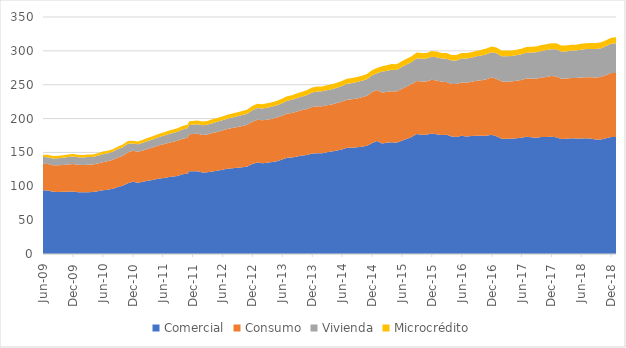
| Category | Comercial | Consumo | Vivienda | Microcrédito |
|---|---|---|---|---|
| 2009-06-01 | 94225.092 | 39039.837 | 9916.214 | 3437.867 |
| 2009-07-01 | 93686.3 | 39134.007 | 10150.324 | 3510.122 |
| 2009-08-01 | 91938.416 | 39244.316 | 10003.677 | 3579.272 |
| 2009-09-01 | 91622.144 | 39394.034 | 10320.07 | 3648.828 |
| 2009-10-01 | 91892.654 | 39705.636 | 10636.736 | 3727.088 |
| 2009-11-01 | 91781.249 | 40412.918 | 10924.337 | 3753.382 |
| 2009-12-01 | 92316.734 | 40580.035 | 10958.491 | 3763.796 |
| 2010-01-01 | 91199.98 | 40461.016 | 11111.676 | 3744.079 |
| 2010-02-01 | 91151.357 | 40379.171 | 11120.686 | 3731.914 |
| 2010-03-01 | 91209.664 | 40456.595 | 11423.084 | 3712.817 |
| 2010-04-01 | 91500.243 | 40556.6 | 11220.527 | 3716.143 |
| 2010-05-01 | 92567.665 | 41038.504 | 11548.231 | 3728.21 |
| 2010-06-01 | 94126.09 | 41507.552 | 11853.031 | 3758.381 |
| 2010-07-01 | 95051.178 | 42085.769 | 11622.499 | 3786.095 |
| 2010-08-01 | 96369.209 | 42696.853 | 11936.118 | 3851.131 |
| 2010-09-01 | 98987.373 | 43582.775 | 12362.652 | 3917.474 |
| 2010-10-01 | 100913.874 | 44344.201 | 12442.525 | 4008.094 |
| 2010-11-01 | 104608.953 | 45201.392 | 12821.618 | 4069.382 |
| 2010-12-01 | 106588.318 | 45779.138 | 10693.835 | 4090.206 |
| 2011-01-01 | 105171.857 | 45865.705 | 10945.951 | 4077.86 |
| 2011-02-01 | 106726.433 | 46261.907 | 11248.09 | 4608.809 |
| 2011-03-01 | 108153.454 | 46903.448 | 11644.89 | 4678.279 |
| 2011-04-01 | 109387.742 | 47851.951 | 11992.957 | 4751.729 |
| 2011-05-11 | 111376.414 | 49121.711 | 12404.411 | 4826.404 |
| 2011-06-11 | 112339.645 | 50059.867 | 12571.017 | 4900.678 |
| 2011-07-11 | 113604.77 | 50844.241 | 12921.269 | 4977.234 |
| 2011-08-31 | 115314.981 | 51849.806 | 13360.476 | 5095.459 |
| 2011-09-30 | 117702.68 | 52618.468 | 13442.802 | 5194.083 |
| 2011-10-31 | 118376.037 | 53370.06 | 13811.601 | 5321.633 |
| 2011-11-11 | 122282.476 | 54417.227 | 13860.85 | 5417.079 |
| 2011-12-31 | 122385.942 | 55192.623 | 14210.286 | 5454.024 |
| 2012-01-31 | 120434.091 | 55260.829 | 14423.651 | 5465.727 |
| 2012-02-29 | 120721.608 | 55773.177 | 14347.215 | 5491.145 |
| 2012-03-31 | 121926.609 | 56616.237 | 14706.737 | 5565.246 |
| 2012-04-30 | 122884.787 | 57328.547 | 14985.871 | 5596.72 |
| 2012-05-31 | 124496.75 | 58068.424 | 14981.193 | 5660.338 |
| 2012-06-30 | 125721.639 | 58784.489 | 15275.83 | 5753.546 |
| 2012-07-31 | 126539.431 | 59547.306 | 15664.714 | 5857.582 |
| 2012-08-31 | 127257.797 | 60342.483 | 15758.51 | 5979.546 |
| 2012-09-30 | 128160.073 | 60872.119 | 16092.186 | 6085.79 |
| 2012-10-31 | 129299.427 | 61536.207 | 16424.069 | 6212.124 |
| 2012-11-30 | 132775.232 | 62572.754 | 16863.286 | 6316.602 |
| 2012-12-31 | 135094.961 | 63175.687 | 17231.223 | 6374.602 |
| 2013-01-31 | 134133.095 | 63290.876 | 17449.605 | 6405.61 |
| 2013-02-28 | 134883.525 | 63510.2 | 17689.381 | 6445.772 |
| 2013-03-31 | 135866.857 | 63849.7 | 17945.065 | 6499.403 |
| 2013-04-30 | 137136.038 | 64344.094 | 18239.868 | 6595.629 |
| 2013-05-31 | 139408.58 | 64804.007 | 18330.786 | 6697.611 |
| 2013-06-30 | 142288.574 | 65170.116 | 18756.786 | 6773.643 |
| 2013-07-31 | 142494.889 | 65861.557 | 19259.327 | 6900.213 |
| 2013-08-31 | 144007.146 | 66516.557 | 19702.548 | 6995.924 |
| 2013-09-30 | 145403.168 | 67079.344 | 20127.025 | 7093.089 |
| 2013-10-31 | 146268.053 | 68021.023 | 20696.909 | 7125.48 |
| 2013-11-30 | 148358.241 | 68910.46 | 21252.95 | 7249.976 |
| 2013-12-31 | 148838.276 | 69373.491 | 21665.944 | 7338.096 |
| 2014-01-31 | 148942.116 | 69315.478 | 21930.478 | 7303.865 |
| 2014-02-28 | 150412.115 | 69303.052 | 22228.763 | 7291.667 |
| 2014-03-31 | 151345.727 | 69487.788 | 22493.109 | 7360.341 |
| 2014-04-30 | 152908.808 | 69931.776 | 22786.276 | 7405.942 |
| 2014-05-31 | 154486.55 | 70446.328 | 23128.392 | 7455.334 |
| 2014-06-30 | 156898.732 | 70924.462 | 23473.33 | 7497.686 |
| 2014-07-31 | 156830.207 | 71582.185 | 23801.022 | 7559.254 |
| 2014-08-31 | 157563.483 | 72224.855 | 24101.352 | 7608.588 |
| 2014-09-30 | 158514.424 | 73145.333 | 24034.463 | 7678.6 |
| 2014-10-31 | 159696.895 | 74035.454 | 24422.47 | 7736.464 |
| 2014-11-30 | 163614.663 | 75260.304 | 24761.588 | 7774.996 |
| 2014-12-31 | 166705.473 | 75650.198 | 24755.571 | 7747.888 |
| 2015-01-31 | 163315.606 | 75341.043 | 30819.225 | 7680.142 |
| 2015-02-28 | 164278.371 | 74980.247 | 30929.972 | 8400.435 |
| 2015-03-31 | 165050.994 | 75405.453 | 31684.066 | 8407.426 |
| 2015-04-30 | 164249.311 | 75693.139 | 31761.168 | 8420.3 |
| 2015-05-31 | 167422.419 | 76261.883 | 32402.217 | 8422.729 |
| 2015-06-30 | 169965.828 | 77401.88 | 32479.097 | 8455.521 |
| 2015-07-31 | 172667.96 | 77930.329 | 33056.947 | 8493.887 |
| 2015-08-31 | 177379.951 | 78281.391 | 33374.4 | 8443.085 |
| 2015-09-30 | 176251.246 | 78544.206 | 33731.52 | 8440.566 |
| 2015-10-30 | 176049.848 | 78775.944 | 33720.395 | 8438.798 |
| 2015-11-30 | 177924.471 | 79255.577 | 34118.09 | 8428.981 |
| 2015-12-30 | 176711.971 | 79392.279 | 34470.809 | 8366.324 |
| 2016-01-30 | 175761.992 | 78477.765 | 34317.909 | 8233.932 |
| 2016-02-29 | 176121.798 | 78042.24 | 34338.548 | 8162.77 |
| 2016-03-31 | 173353.853 | 77807.388 | 34456.662 | 8100.781 |
| 2016-04-30 | 172766.995 | 78277.811 | 34805.944 | 8139.28 |
| 2016-05-30 | 174588.481 | 78835.9 | 35139.457 | 8150.009 |
| 2016-06-30 | 173417.751 | 79658.103 | 35466.962 | 8131.993 |
| 2016-07-30 | 174257.309 | 79945.888 | 35710.133 | 8142.345 |
| 2016-08-30 | 174509.208 | 81181.793 | 36299.212 | 8275.451 |
| 2016-09-30 | 174506.513 | 82171.752 | 36475.237 | 8364.513 |
| 2016-10-30 | 174771.978 | 83196.086 | 36969.921 | 8414.928 |
| 2016-11-30 | 176171.539 | 84465.468 | 37194.073 | 8456.275 |
| 2016-12-30 | 173873.142 | 84992.064 | 37605.22 | 8438.897 |
| 2017-01-31 | 170324.418 | 84467.464 | 37375.846 | 8380.706 |
| 2017-02-28 | 170356.643 | 84162.808 | 37513.303 | 8349.835 |
| 2017-03-31 | 170326.707 | 84504.408 | 37509.539 | 8366.156 |
| 2017-04-30 | 171033.862 | 84644.667 | 37683.253 | 8362.032 |
| 2017-05-31 | 171519.194 | 85378.136 | 38004.315 | 8381.592 |
| 2017-06-30 | 173209.859 | 86016.396 | 38043.545 | 8491.16 |
| 2017-07-30 | 172526.026 | 86656.658 | 38425.333 | 8575.309 |
| 2017-08-30 | 171783.233 | 87166.111 | 38814.176 | 8637.179 |
| 2017-09-30 | 172762.73 | 87880.661 | 39266.68 | 8703.119 |
| 2017-10-30 | 172863.305 | 88605.568 | 39617.546 | 8717.626 |
| 2017-11-30 | 173042.925 | 89651.622 | 39793.94 | 8753.192 |
| 2017-12-30 | 172596.89 | 89563.817 | 40239.605 | 8734.887 |
| 2018-01-30 | 169911.972 | 89070.834 | 40111.628 | 8695.607 |
| 2018-02-28 | 170210.29 | 88880.947 | 40024.869 | 8682.402 |
| 2018-03-30 | 171013.428 | 89004.236 | 40463.231 | 8655.768 |
| 2018-04-30 | 170421.844 | 89342.514 | 40713.32 | 8655.073 |
| 2018-05-30 | 170698.577 | 89887.197 | 41082.371 | 8673.964 |
| 2018-06-30 | 170870.743 | 90263.689 | 41480.323 | 8674.324 |
| 2018-07-30 | 170188.256 | 90923.278 | 41618.29 | 8700.458 |
| 2018-08-30 | 169095.322 | 91711.939 | 42052.745 | 8727.109 |
| 2018-09-30 | 169097.524 | 92281.031 | 42444.218 | 8719.839 |
| 2018-10-30 | 170975.194 | 93219.779 | 42895.77 | 8756.964 |
| 2018-11-30 | 172618.374 | 94554.189 | 43349.35 | 8803.117 |
| 2018-12-30 | 172669.467 | 94803.286 | 43747.528 | 8764.896 |